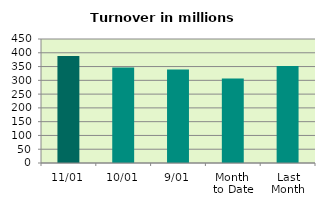
| Category | Series 0 |
|---|---|
| 11/01 | 388.372 |
| 10/01 | 346.617 |
| 9/01 | 339.767 |
| Month 
to Date | 306.338 |
| Last
Month | 352.227 |